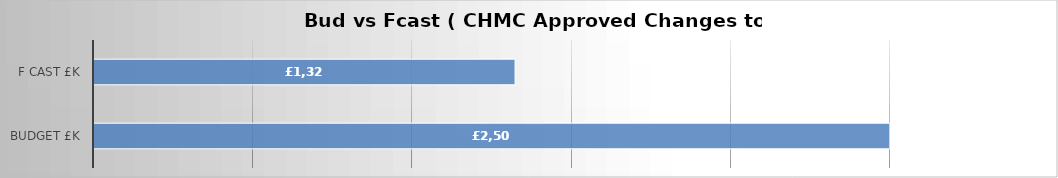
| Category | Series 0 |
|---|---|
| Budget £k | 2500 |
| F cast £k | 1322.696 |